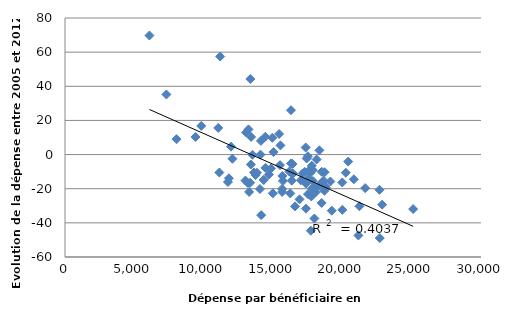
| Category | Series 0 |
|---|---|
| 18069.27609133858 | -19.196 |
| 17139.158149161827 | -11.043 |
| 16181.22666804022 | -9.96 |
| 14987.642197862022 | -22.727 |
| 15535.49950970921 | 5.372 |
| 13745.168476967448 | -12 |
| 17983.790553903804 | -37.444 |
| 14098.459201936415 | -0.011 |
| 16297.402962926593 | 25.976 |
| 14060.526075989146 | -20.17 |
| 11751.796899653991 | -16.059 |
| 17814.47931053896 | -19.8 |
| 18144.082866449768 | -2.866 |
| 11051.078398800099 | 15.598 |
| 17717.83879554421 | -8.338 |
| 13633.449669961221 | -10.461 |
| 17519.831566958077 | -23.18 |
| 12075.689900984278 | -2.451 |
| 25106.71566287181 | -31.938 |
| 7312.861270302771 | 35.214 |
| 6089.334578816024 | 69.735 |
| 18510.50575848328 | -28.345 |
| 15716.394368261712 | -15.436 |
| 20249.35247955088 | -10.64 |
| 16244.578281075721 | -22.726 |
| 19236.959072978763 | -32.889 |
| 20002.566873481395 | -32.382 |
| 13352.001713946216 | -16.518 |
| 21646.73553625849 | -19.659 |
| 13232.499125467255 | 14.746 |
| 16301.693707385368 | -5.19 |
| 22679.854337767625 | -20.621 |
| 16353.177209877202 | -15.281 |
| 15440.200852927475 | 12.043 |
| 17556.55028937227 | -13.967 |
| 14444.152919081711 | 10.43 |
| 17878.982078154233 | -15.475 |
| 18346.231006462738 | -18.222 |
| 22872.89076502319 | -29.342 |
| 21159.977449662536 | -47.385 |
| 17291.012429631493 | -10.19 |
| 14458.395175509013 | -7.764 |
| 14339.65711745067 | -14.817 |
| 17360.0534311599 | 4.14 |
| 16914.75494015717 | -26.22 |
| 18458.07547917246 | -16.95 |
| 22701.422890119222 | -48.911 |
| 17378.36586215637 | -17.019 |
| 17727.215348968482 | -44.6 |
| 18077.32130003146 | -22.109 |
| 13842.928494929149 | -10.634 |
| 11974.319100296456 | 4.619 |
| 13013.337473370322 | -15.216 |
| 15673.716707626752 | -12.531 |
| 14322.657219173238 | -14.806 |
| 18712.59077835525 | -21.186 |
| 13174.051796168087 | -16.556 |
| 11819.546556985331 | -13.887 |
| 17759.816031632523 | -24.552 |
| 17795.444948499025 | -6.55 |
| 15660.864102284146 | -21.896 |
| 16351.42149884253 | -11.021 |
| 14947.402152517994 | 9.794 |
| 17013.520591556382 | -15.034 |
| 15505.373814907514 | -6.165 |
| 14126.640401789591 | 8.021 |
| 13065.017254526978 | 12.938 |
| 14861.311353049909 | -8.101 |
| 15658.665312192235 | -20.126 |
| 18721.54554827603 | -10.342 |
| 17376.259509960695 | -31.675 |
| 17689.514462493236 | -10.683 |
| 17873.156106110877 | -9.073 |
| 14701.27535025967 | -11.686 |
| 18644.1006639928 | -15.222 |
| 15037.869536923301 | 1.46 |
| 13421.100808505309 | 10.347 |
| 18344.24415863206 | 2.464 |
| 19991.936502425313 | -16.335 |
| 13280.338585006431 | -21.871 |
| 13402.620206440843 | -5.817 |
| 20831.174295270608 | -14.47 |
| 19138.286418451713 | -15.783 |
| 16406.887048417393 | -5.518 |
| 18815.59735443086 | -19.215 |
| 21234.15295698184 | -30.268 |
| 16590.784093764676 | -30.361 |
| 17510.89242091598 | -1.012 |
| 11128.35787265354 | -10.518 |
| 16452.227585807363 | -11.113 |
| 14145.307533572193 | -35.477 |
| 20422.47703624531 | -4.104 |
| 13366.614899935805 | 44.275 |
| 17431.552243776256 | -2.311 |
| 13521.712116767934 | -0.135 |
| 18515.61070432811 | -10.079 |
| 9826.485787155547 | 16.777 |
| 8041.223859400937 | 9.025 |
| 11190.813679547504 | 57.424 |
| 9414.194666617677 | 10.311 |